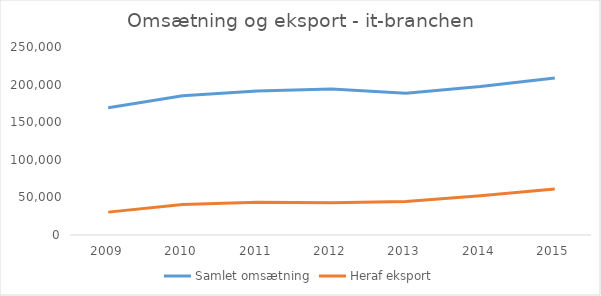
| Category | Samlet omsætning | Heraf eksport |
|---|---|---|
| 2009.0 | 169288 | 30412 |
| 2010.0 | 185148 | 40501 |
| 2011.0 | 191521 | 43447 |
| 2012.0 | 194006 | 42798 |
| 2013.0 | 188611 | 44624 |
| 2014.0 | 197516 | 52304 |
| 2015.0 | 208706 | 61198 |